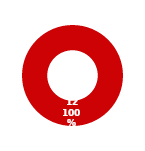
| Category | RISK |
|---|---|
| MIL 3 Complete | 0 |
| MIL 3 Not Complete | 12 |